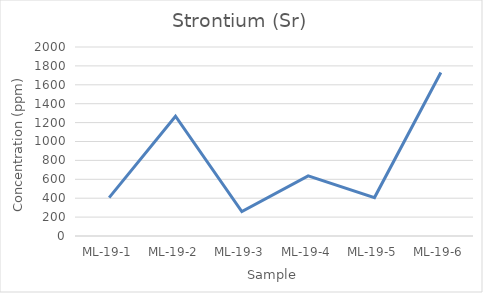
| Category | Series 0 |
|---|---|
| ML-19-1 | 406.066 |
| ML-19-2 | 1267.509 |
| ML-19-3 | 258.806 |
| ML-19-4 | 636.274 |
| ML-19-5 | 406.664 |
| ML-19-6 | 1730.447 |